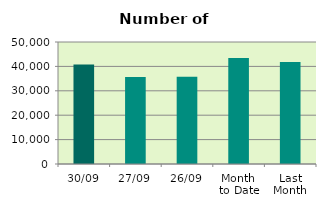
| Category | Series 0 |
|---|---|
| 30/09 | 40736 |
| 27/09 | 35616 |
| 26/09 | 35726 |
| Month 
to Date | 43452.667 |
| Last
Month | 41849.545 |